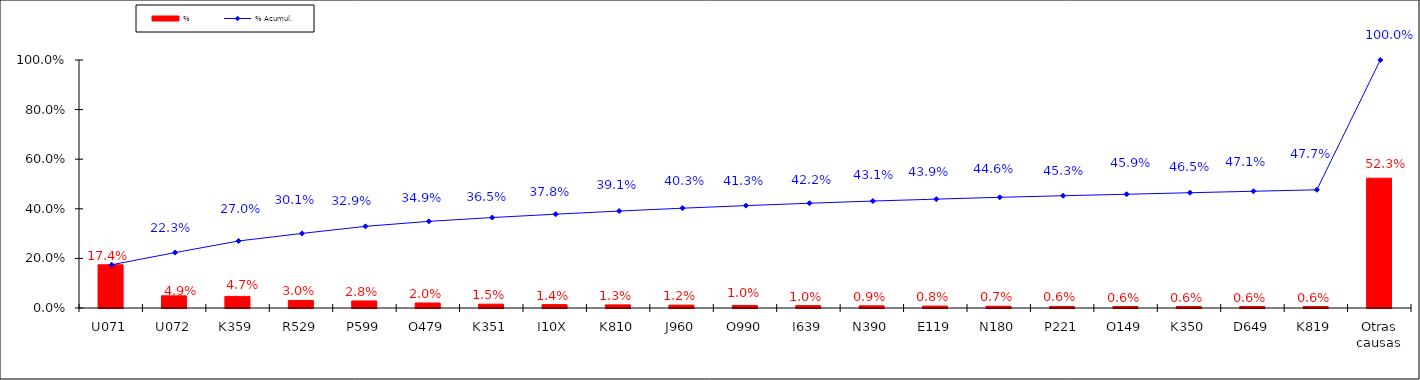
| Category | % |
|---|---|
| U071 | 0.174 |
| U072 | 0.049 |
| K359 | 0.047 |
| R529 | 0.03 |
| P599 | 0.028 |
| O479 | 0.02 |
| K351 | 0.015 |
| I10X | 0.014 |
| K810 | 0.013 |
| J960 | 0.012 |
| O990 | 0.01 |
| I639 | 0.01 |
| N390 | 0.009 |
| E119 | 0.008 |
| N180 | 0.007 |
| P221 | 0.006 |
| O149 | 0.006 |
| K350 | 0.006 |
| D649 | 0.006 |
| K819 | 0.006 |
| Otras causas | 0.523 |